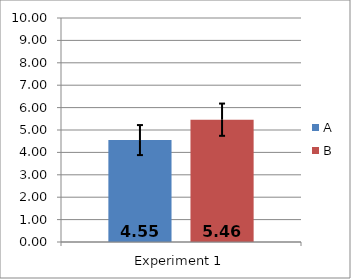
| Category | A | B |
|---|---|---|
| 0 | 4.55 | 5.46 |